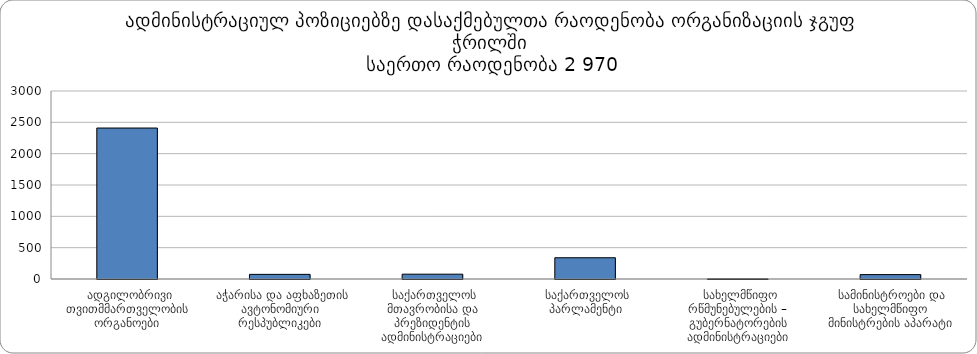
| Category | ჯამი |
|---|---|
|  ადგილობრივი თვითმმართველობის ორგანოები | 2409 |
|  აჭარისა და აფხაზეთის ავტონომიური რესპუბლიკები | 74 |
|  საქართველოს მთავრობისა და პრეზიდენტის ადმინისტრაციები | 77 |
|  საქართველოს პარლამენტი | 339 |
|  სახელმწიფო რწმუნებულების – გუბერნატორების ადმინისტრაციები | 1 |
|  სამინისტროები და სახელმწიფო მინისტრების აპარატი | 70 |